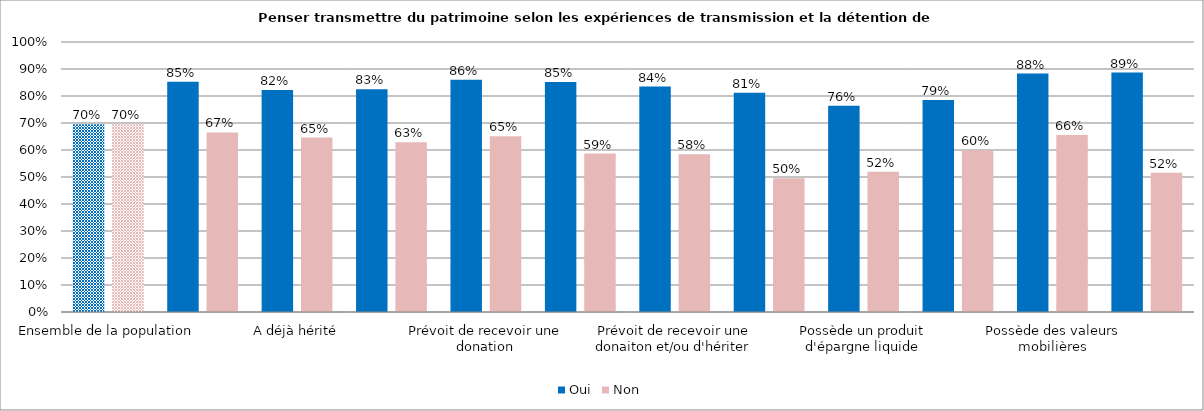
| Category | Oui | Non |
|---|---|---|
| Ensemble de la population | 0.695 | 0.695 |
| A déjà reçu une donation | 0.853 | 0.665 |
| A déjà hérité | 0.822 | 0.646 |
| A déjà reçu une donation et/ou hérité | 0.825 | 0.629 |
| Prévoit de recevoir une donation | 0.86 | 0.651 |
| Prévoit de recevoir un héritage | 0.852 | 0.587 |
| Prévoit de recevoir une donaiton et/ou d'hériter | 0.835 | 0.584 |
| A reçu et prévoit de recevoir une donation et/ou un héritage | 0.812 | 0.495 |
| Possède un produit d'épargne liquide | 0.764 | 0.519 |
| Possède une assurance vie | 0.785 | 0.599 |
| Possède des valeurs mobilières | 0.883 | 0.656 |
| Est propriétaire | 0.887 | 0.516 |